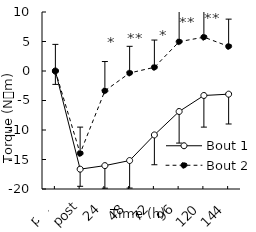
| Category | Bout 1 | Bout 2 |
|---|---|---|
| pre | 0 | 0 |
| post | -16.638 | -13.962 |
| 24 | -16.038 | -3.363 |
| 48 | -15.175 | -0.337 |
| 72 | -10.837 | 0.625 |
| 96 | -6.863 | 4.963 |
| 120 | -4.15 | 5.738 |
| 144 | -3.925 | 4.175 |